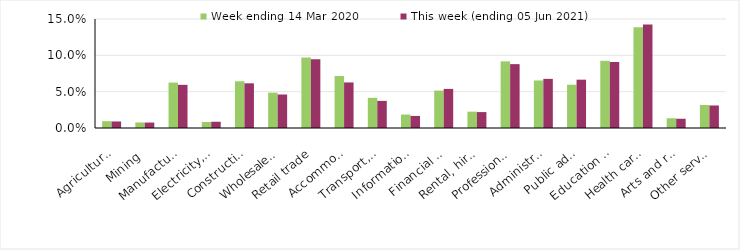
| Category | Week ending 14 Mar 2020 | This week (ending 05 Jun 2021) |
|---|---|---|
| Agriculture, forestry and fishing | 0.009 | 0.009 |
| Mining | 0.008 | 0.008 |
| Manufacturing | 0.062 | 0.059 |
| Electricity, gas, water and waste services | 0.008 | 0.009 |
| Construction | 0.064 | 0.062 |
| Wholesale trade | 0.049 | 0.046 |
| Retail trade | 0.097 | 0.095 |
| Accommodation and food services | 0.072 | 0.063 |
| Transport, postal and warehousing | 0.042 | 0.037 |
| Information media and telecommunications | 0.018 | 0.017 |
| Financial and insurance services | 0.052 | 0.054 |
| Rental, hiring and real estate services | 0.022 | 0.022 |
| Professional, scientific and technical services | 0.092 | 0.088 |
| Administrative and support services | 0.065 | 0.068 |
| Public administration and safety | 0.06 | 0.066 |
| Education and training | 0.092 | 0.091 |
| Health care and social assistance | 0.139 | 0.142 |
| Arts and recreation services | 0.013 | 0.013 |
| Other services | 0.032 | 0.031 |